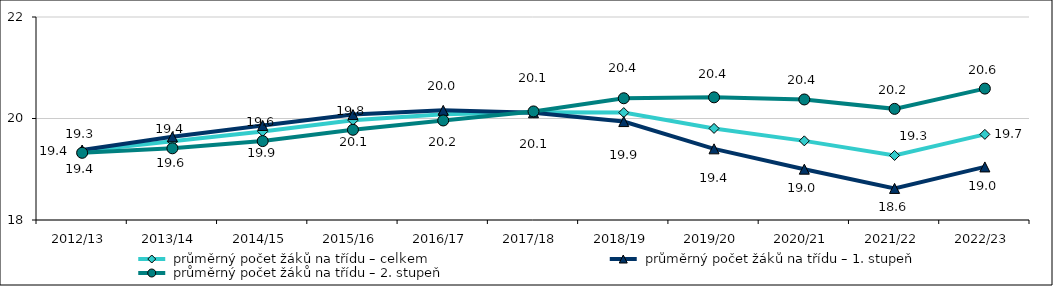
| Category |  průměrný počet žáků na třídu – celkem |  průměrný počet žáků na třídu – 1. stupeň |  průměrný počet žáků na třídu – 2. stupeň |
|---|---|---|---|
| 2012/13 | 19.357 | 19.379 | 19.324 |
| 2013/14 | 19.551 | 19.639 | 19.413 |
| 2014/15 | 19.745 | 19.863 | 19.555 |
| 2015/16 | 19.964 | 20.077 | 19.778 |
| 2016/17 | 20.086 | 20.16 | 19.961 |
| 2017/18 | 20.123 | 20.112 | 20.14 |
| 2018/19 | 20.116 | 19.94 | 20.399 |
| 2019/20 | 19.805 | 19.402 | 20.417 |
| 2020/21 | 19.56 | 19.001 | 20.375 |
| 2021/22 | 19.272 | 18.622 | 20.19 |
| 2022/23 | 19.687 | 19.046 | 20.589 |